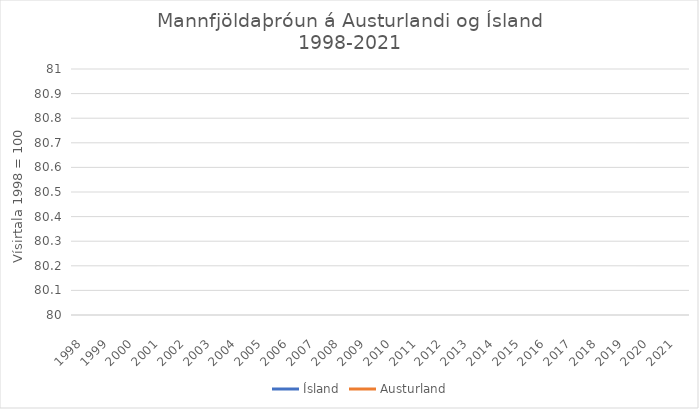
| Category | Ísland | Austurland |
|---|---|---|
| 1998.0 | 100 | 100 |
| 1999.0 | 101.223 | 97.597 |
| 2000.0 | 102.448 | 96.199 |
| 2001.0 | 104.031 | 94.591 |
| 2002.0 | 105.211 | 93.756 |
| 2003.0 | 105.907 | 93.304 |
| 2004.0 | 106.678 | 95.043 |
| 2005.0 | 107.782 | 101.277 |
| 2006.0 | 110.1 | 115.785 |
| 2007.0 | 112.956 | 132.566 |
| 2008.0 | 115.815 | 119.415 |
| 2009.0 | 117.25 | 107.953 |
| 2010.0 | 116.612 | 104.293 |
| 2011.0 | 116.914 | 102.423 |
| 2012.0 | 117.326 | 102.684 |
| 2013.0 | 118.164 | 103.237 |
| 2014.0 | 119.565 | 104.132 |
| 2015.0 | 120.823 | 104.022 |
| 2016.0 | 122.082 | 103.368 |
| 2017.0 | 124.219 | 103.66 |
| 2018.0 | 127.927 | 105.419 |
| 2019.0 | 131.063 | 107.279 |
| 2020.0 | 133.686 | 107.973 |
| 2021.0 | 135.396 | 109.089 |